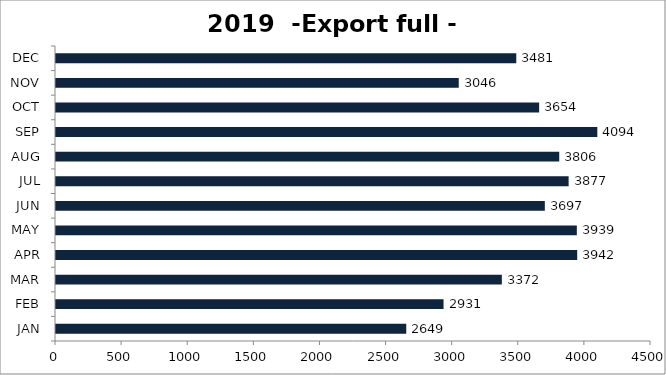
| Category | Export full - 20' |
|---|---|
| JAN | 2649 |
| FEB | 2931 |
| MAR | 3372 |
| APR | 3942 |
| MAY | 3939 |
| JUN | 3697 |
| JUL | 3877 |
| AUG | 3806 |
| SEP | 4094 |
| OCT | 3654 |
| NOV | 3046 |
| DEC | 3481 |